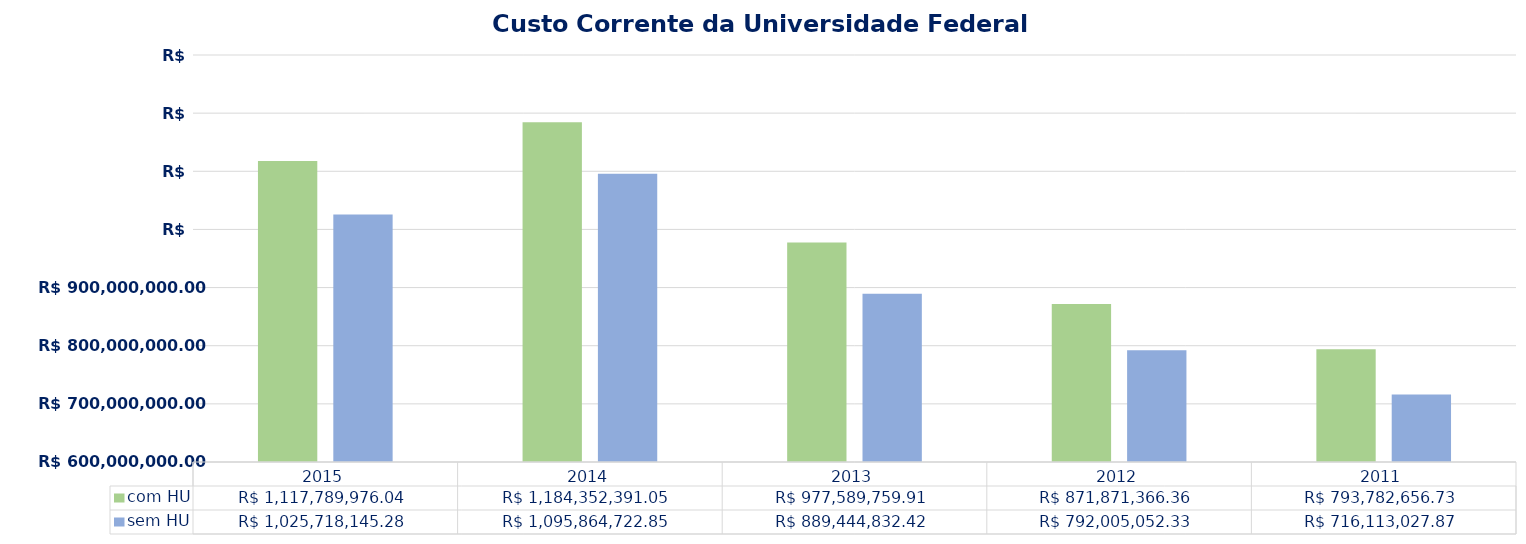
| Category | com HU | sem HU |
|---|---|---|
| 2015.0 | 1117789976.044 | 1025718145.28 |
| 2014.0 | 1184352391.05 | 1095864722.85 |
| 2013.0 | 977589759.909 | 889444832.42 |
| 2012.0 | 871871366.364 | 792005052.33 |
| 2011.0 | 793782656.732 | 716113027.87 |